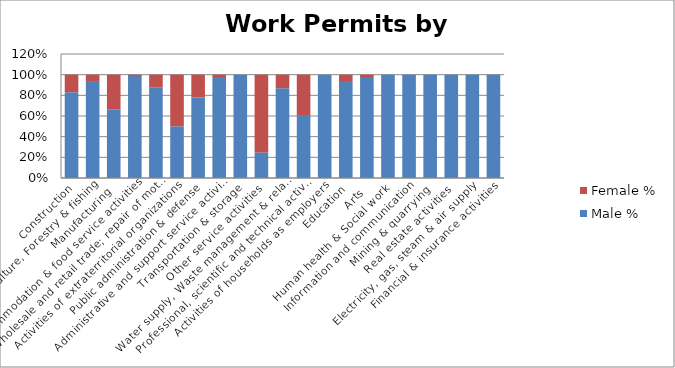
| Category | Male % | Female % |
|---|---|---|
| Construction | 0.831 | 0.169 |
| Agriculture, Forestry & fishing | 0.93 | 0.07 |
| Manufacturing | 0.666 | 0.334 |
| Accommodation & food service activities | 0.986 | 0.014 |
| Wholesale and retail trade; repair of motor vehicles  | 0.874 | 0.126 |
| Activities of extraterritorial organizations  | 0.5 | 0.5 |
| Public administration & defense | 0.778 | 0.222 |
| Administrative and support service activities | 0.968 | 0.032 |
|  Transportation & storage | 1 | 0 |
| Other service activities | 0.247 | 0.753 |
| Water supply, Waste management & related activities | 0.869 | 0.131 |
| Professional, scientific and technical activities | 0.609 | 0.391 |
| Activities of households as employers | 1 | 0 |
| Education | 0.938 | 0.062 |
| Arts | 0.968 | 0.032 |
| Human health & Social work | 1 | 0 |
|  Information and communication | 1 | 0 |
| Mining & quarrying | 1 | 0 |
| Real estate activities | 1 | 0 |
| Electricity, gas, steam & air supply | 1 | 0 |
| Financial & insurance activities | 1 | 0 |